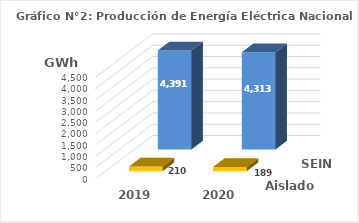
| Category | Aislados | SEIN |
|---|---|---|
| 2019.0 | 210.328 | 4391.103 |
| 2020.0 | 188.836 | 4313.402 |